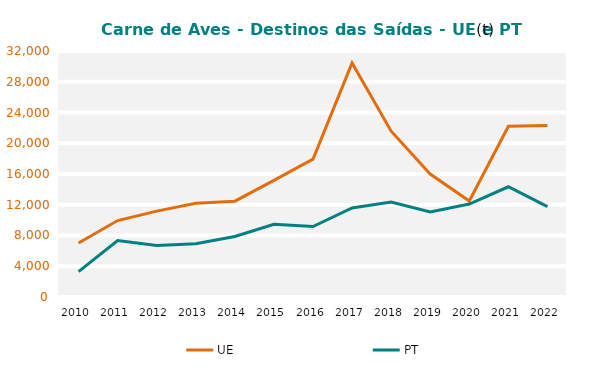
| Category | UE | PT |
|---|---|---|
| 2010.0 | 7032.102 | 3307.504 |
| 2011.0 | 9946.314 | 7341.883 |
| 2012.0 | 11172.526 | 6711.688 |
| 2013.0 | 12183.745 | 6914.294 |
| 2014.0 | 12465.537 | 7870.915 |
| 2015.0 | 15169.533 | 9461.801 |
| 2016.0 | 17929.031 | 9162.664 |
| 2017.0 | 30439.078 | 11587.269 |
| 2018.0 | 21571.119 | 12359.8 |
| 2019.0 | 16001.178 | 11059.82 |
| 2020.0 | 12488.737 | 12090.594 |
| 2021.0 | 22202.117 | 14337.1 |
| 2022.0 | 22298.967 | 11747.419 |